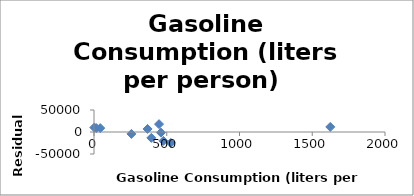
| Category | Series 0 |
|---|---|
| 2.0 | 10225.107 |
| 394.0 | -13422.64 |
| 368.0 | 6938.981 |
| 447.0 | 17853.902 |
| 16.0 | 8738.08 |
| 477.0 | -20150.583 |
| 43.0 | 8869.243 |
| 257.0 | -4342.022 |
| 460.0 | -1398.908 |
| 1624.0 | 11507.447 |
| 528.0 | -24818.609 |